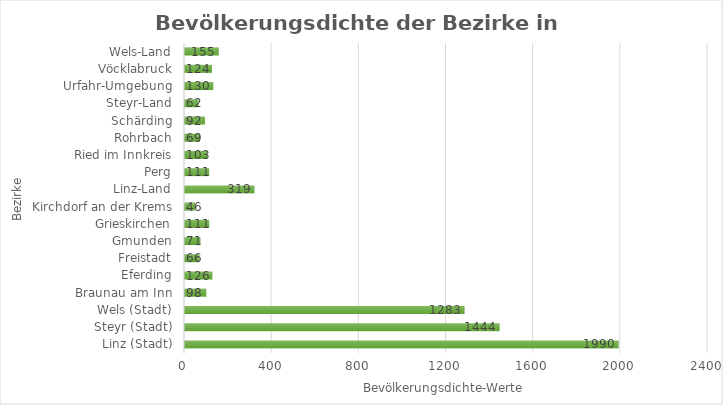
| Category | Series 0 |
|---|---|
| Linz (Stadt) | 1990 |
| Steyr (Stadt) | 1444 |
| Wels (Stadt) | 1283 |
| Braunau am Inn | 98 |
| Eferding | 126 |
| Freistadt | 66 |
| Gmunden | 71 |
| Grieskirchen | 111 |
| Kirchdorf an der Krems | 46 |
| Linz-Land | 319 |
| Perg | 111 |
| Ried im Innkreis | 103 |
| Rohrbach | 69 |
| Schärding | 92 |
| Steyr-Land | 62 |
| Urfahr-Umgebung | 130 |
| Vöcklabruck | 124 |
| Wels-Land | 155 |